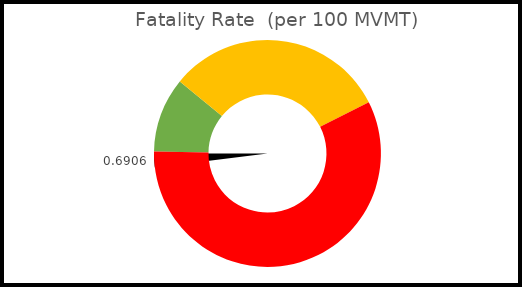
| Category | Pointer |
|---|---|
| 0 | 0.691 |
| 1 | 0.014 |
| 2 | 6.742 |